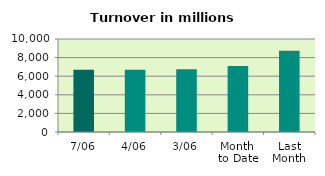
| Category | Series 0 |
|---|---|
| 7/06 | 6706.976 |
| 4/06 | 6685.623 |
| 3/06 | 6744.619 |
| Month 
to Date | 7109.074 |
| Last
Month | 8745.898 |